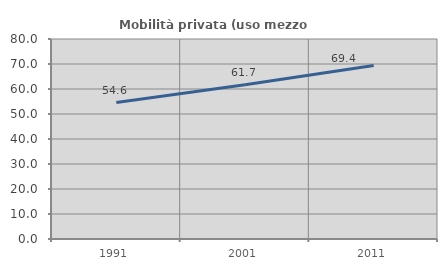
| Category | Mobilità privata (uso mezzo privato) |
|---|---|
| 1991.0 | 54.556 |
| 2001.0 | 61.674 |
| 2011.0 | 69.373 |